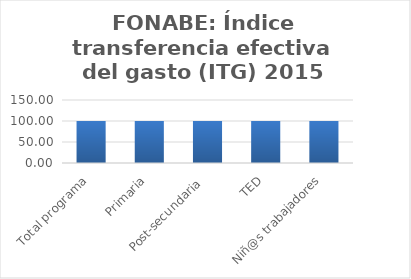
| Category | Índice transferencia efectiva del gasto (ITG) |
|---|---|
| Total programa | 100 |
| Primaria | 100 |
| Post-secundaria  | 100 |
| TED | 100 |
| Niñ@s trabajadores | 100 |